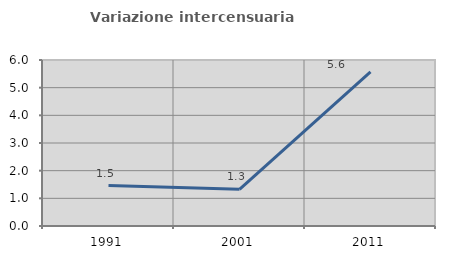
| Category | Variazione intercensuaria annua |
|---|---|
| 1991.0 | 1.462 |
| 2001.0 | 1.327 |
| 2011.0 | 5.571 |